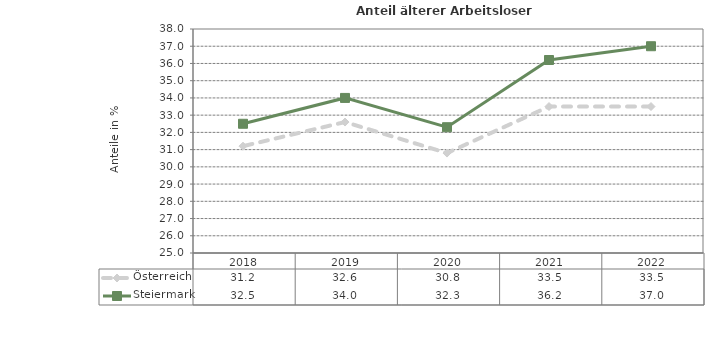
| Category | Österreich | Steiermark |
|---|---|---|
| 2022.0 | 33.5 | 37 |
| 2021.0 | 33.5 | 36.2 |
| 2020.0 | 30.8 | 32.3 |
| 2019.0 | 32.6 | 34 |
| 2018.0 | 31.2 | 32.5 |